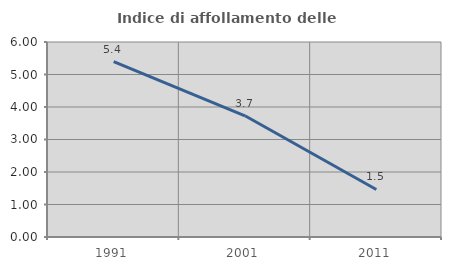
| Category | Indice di affollamento delle abitazioni  |
|---|---|
| 1991.0 | 5.394 |
| 2001.0 | 3.73 |
| 2011.0 | 1.463 |